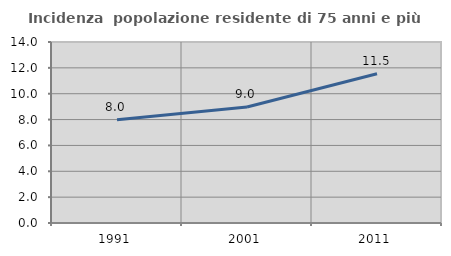
| Category | Incidenza  popolazione residente di 75 anni e più |
|---|---|
| 1991.0 | 7.982 |
| 2001.0 | 8.974 |
| 2011.0 | 11.538 |